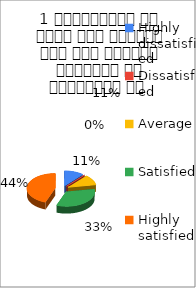
| Category | 1 व्याख्यान से रूचि में वृद्धि हुई एवं शिक्षण जानकारी से परिपूर्ण था  |
|---|---|
| Highly dissatisfied | 1 |
| Dissatisfied | 0 |
| Average | 1 |
| Satisfied | 3 |
| Highly satisfied | 4 |